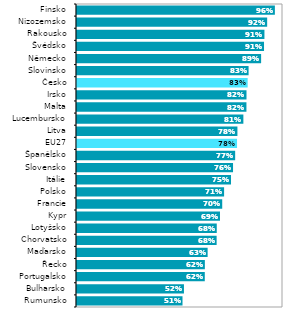
| Category | Series 1 |
|---|---|
| Rumunsko | 0.512 |
| Bulharsko | 0.519 |
| Portugalsko | 0.62 |
| Řecko | 0.621 |
| Maďarsko | 0.634 |
| Chorvatsko | 0.678 |
| Lotyšsko | 0.678 |
| Kypr | 0.694 |
| Francie | 0.705 |
| Polsko | 0.714 |
| Itálie | 0.748 |
| Slovensko | 0.757 |
| Španělsko | 0.768 |
| EU27 | 0.777 |
| Litva | 0.779 |
| Lucembursko | 0.808 |
| Malta | 0.823 |
| Irsko | 0.823 |
| Česko | 0.828 |
| Slovinsko | 0.833 |
| Německo | 0.894 |
| Švédsko | 0.908 |
| Rakousko | 0.91 |
| Nizozemsko | 0.923 |
| Finsko | 0.961 |